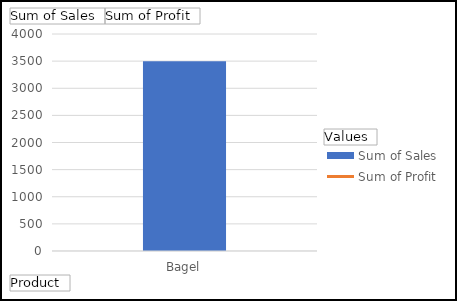
| Category | Sum of Sales |
|---|---|
| Bagel | 3500 |